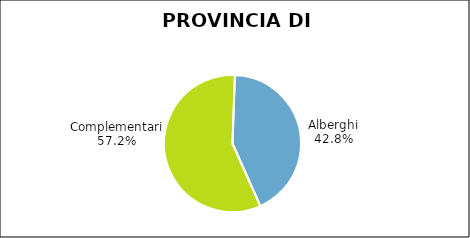
| Category | Provincia di Varese |
|---|---|
| Alberghi | 154 |
| Complementari | 206 |